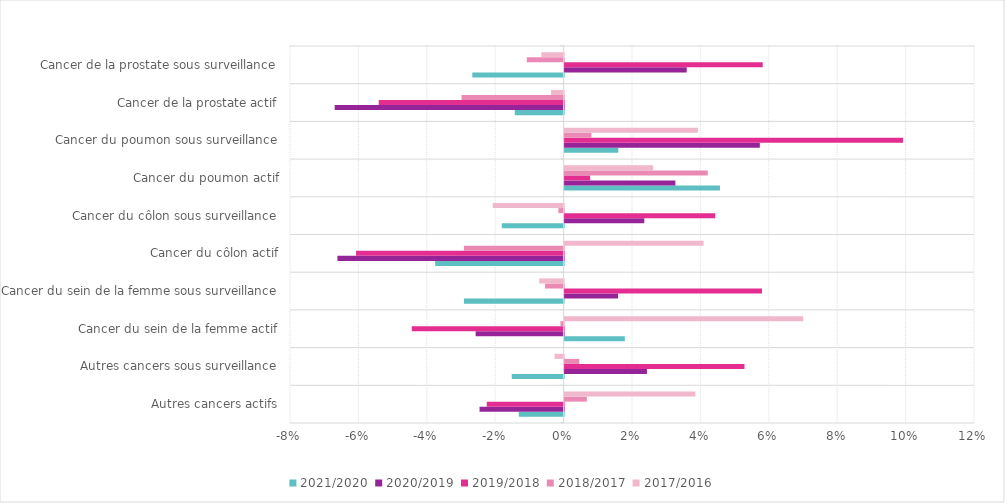
| Category | 2021/2020 | 2020/2019 | 2019/2018 | 2018/2017 | 2017/2016 |
|---|---|---|---|---|---|
| Autres cancers actifs | -0.013 | -0.025 | -0.022 | 0.007 | 0.038 |
| Autres cancers sous surveillance | -0.015 | 0.024 | 0.053 | 0.004 | -0.003 |
| Cancer du sein de la femme actif | 0.018 | -0.026 | -0.044 | -0.001 | 0.07 |
| Cancer du sein de la femme sous surveillance | -0.029 | 0.016 | 0.058 | -0.005 | -0.007 |
| Cancer du côlon actif | -0.038 | -0.066 | -0.061 | -0.029 | 0.041 |
| Cancer du côlon sous surveillance | -0.018 | 0.023 | 0.044 | -0.002 | -0.021 |
| Cancer du poumon actif | 0.045 | 0.032 | 0.007 | 0.042 | 0.026 |
| Cancer du poumon sous surveillance | 0.016 | 0.057 | 0.099 | 0.008 | 0.039 |
| Cancer de la prostate actif | -0.014 | -0.067 | -0.054 | -0.03 | -0.004 |
| Cancer de la prostate sous surveillance | -0.027 | 0.036 | 0.058 | -0.011 | -0.007 |